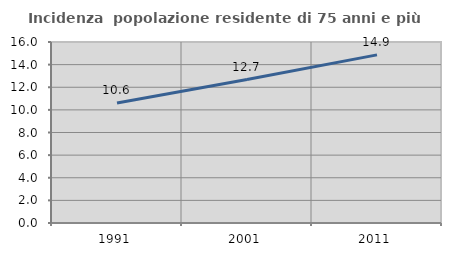
| Category | Incidenza  popolazione residente di 75 anni e più |
|---|---|
| 1991.0 | 10.614 |
| 2001.0 | 12.678 |
| 2011.0 | 14.864 |